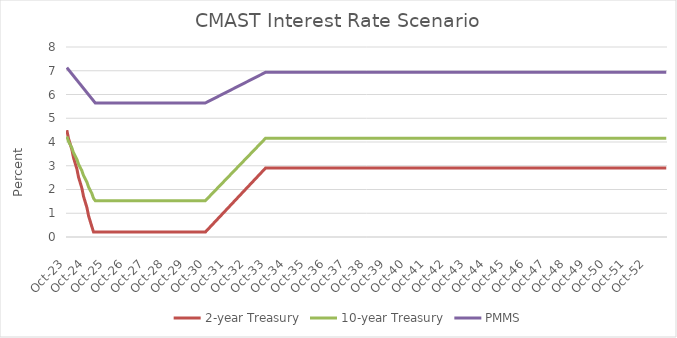
| Category | 2-year Treasury | 10-year Treasury | PMMS |
|---|---|---|---|
| 2023-10-31 | 4.498 | 4.233 | 7.132 |
| 2023-11-30 | 4.149 | 4.027 | 7.045 |
| 2023-12-30 | 3.917 | 3.89 | 6.957 |
| 2024-01-30 | 3.685 | 3.753 | 6.87 |
| 2024-02-29 | 3.336 | 3.547 | 6.782 |
| 2024-03-29 | 3.104 | 3.41 | 6.695 |
| 2024-04-29 | 2.872 | 3.273 | 6.607 |
| 2024-05-29 | 2.523 | 3.067 | 6.52 |
| 2024-06-29 | 2.291 | 2.93 | 6.432 |
| 2024-07-29 | 2.058 | 2.793 | 6.345 |
| 2024-08-29 | 1.71 | 2.587 | 6.257 |
| 2024-09-29 | 1.478 | 2.45 | 6.17 |
| 2024-10-29 | 1.245 | 2.313 | 6.082 |
| 2024-11-29 | 0.897 | 2.107 | 5.995 |
| 2024-12-29 | 0.665 | 1.97 | 5.907 |
| 2025-01-29 | 0.432 | 1.833 | 5.82 |
| 2025-02-28 | 0.21 | 1.627 | 5.732 |
| 2025-03-28 | 0.21 | 1.53 | 5.645 |
| 2025-04-28 | 0.21 | 1.53 | 5.645 |
| 2025-05-28 | 0.21 | 1.53 | 5.645 |
| 2025-06-28 | 0.21 | 1.53 | 5.645 |
| 2025-07-28 | 0.21 | 1.53 | 5.645 |
| 2025-08-28 | 0.21 | 1.53 | 5.645 |
| 2025-09-28 | 0.21 | 1.53 | 5.645 |
| 2025-10-28 | 0.21 | 1.53 | 5.645 |
| 2025-11-28 | 0.21 | 1.53 | 5.645 |
| 2025-12-28 | 0.21 | 1.53 | 5.645 |
| 2026-01-28 | 0.21 | 1.53 | 5.645 |
| 2026-02-28 | 0.21 | 1.53 | 5.645 |
| 2026-03-28 | 0.21 | 1.53 | 5.645 |
| 2026-04-28 | 0.21 | 1.53 | 5.645 |
| 2026-05-28 | 0.21 | 1.53 | 5.645 |
| 2026-06-28 | 0.21 | 1.53 | 5.645 |
| 2026-07-28 | 0.21 | 1.53 | 5.645 |
| 2026-08-28 | 0.21 | 1.53 | 5.645 |
| 2026-09-28 | 0.21 | 1.53 | 5.645 |
| 2026-10-28 | 0.21 | 1.53 | 5.645 |
| 2026-11-28 | 0.21 | 1.53 | 5.645 |
| 2026-12-28 | 0.21 | 1.53 | 5.645 |
| 2027-01-28 | 0.21 | 1.53 | 5.645 |
| 2027-02-28 | 0.21 | 1.53 | 5.645 |
| 2027-03-28 | 0.21 | 1.53 | 5.645 |
| 2027-04-28 | 0.21 | 1.53 | 5.645 |
| 2027-05-28 | 0.21 | 1.53 | 5.645 |
| 2027-06-28 | 0.21 | 1.53 | 5.645 |
| 2027-07-28 | 0.21 | 1.53 | 5.645 |
| 2027-08-28 | 0.21 | 1.53 | 5.645 |
| 2027-09-28 | 0.21 | 1.53 | 5.645 |
| 2027-10-28 | 0.21 | 1.53 | 5.645 |
| 2027-11-28 | 0.21 | 1.53 | 5.645 |
| 2027-12-28 | 0.21 | 1.53 | 5.645 |
| 2028-01-28 | 0.21 | 1.53 | 5.645 |
| 2028-02-28 | 0.21 | 1.53 | 5.645 |
| 2028-03-28 | 0.21 | 1.53 | 5.645 |
| 2028-04-28 | 0.21 | 1.53 | 5.645 |
| 2028-05-28 | 0.21 | 1.53 | 5.645 |
| 2028-06-28 | 0.21 | 1.53 | 5.645 |
| 2028-07-28 | 0.21 | 1.53 | 5.645 |
| 2028-08-28 | 0.21 | 1.53 | 5.645 |
| 2028-09-28 | 0.21 | 1.53 | 5.645 |
| 2028-10-28 | 0.21 | 1.53 | 5.645 |
| 2028-11-28 | 0.21 | 1.53 | 5.645 |
| 2028-12-28 | 0.21 | 1.53 | 5.645 |
| 2029-01-28 | 0.21 | 1.53 | 5.645 |
| 2029-02-28 | 0.21 | 1.53 | 5.645 |
| 2029-03-28 | 0.21 | 1.53 | 5.645 |
| 2029-04-28 | 0.21 | 1.53 | 5.645 |
| 2029-05-28 | 0.21 | 1.53 | 5.645 |
| 2029-06-28 | 0.21 | 1.53 | 5.645 |
| 2029-07-28 | 0.21 | 1.53 | 5.645 |
| 2029-08-28 | 0.21 | 1.53 | 5.645 |
| 2029-09-28 | 0.21 | 1.53 | 5.645 |
| 2029-10-28 | 0.21 | 1.53 | 5.645 |
| 2029-11-28 | 0.21 | 1.53 | 5.645 |
| 2029-12-28 | 0.21 | 1.53 | 5.645 |
| 2030-01-28 | 0.21 | 1.53 | 5.645 |
| 2030-02-28 | 0.21 | 1.53 | 5.645 |
| 2030-03-28 | 0.21 | 1.53 | 5.645 |
| 2030-04-28 | 0.21 | 1.53 | 5.645 |
| 2030-05-28 | 0.21 | 1.53 | 5.645 |
| 2030-06-28 | 0.21 | 1.53 | 5.645 |
| 2030-07-28 | 0.21 | 1.53 | 5.645 |
| 2030-08-28 | 0.21 | 1.53 | 5.645 |
| 2030-09-28 | 0.21 | 1.53 | 5.645 |
| 2030-10-28 | 0.285 | 1.603 | 5.681 |
| 2030-11-28 | 0.359 | 1.676 | 5.717 |
| 2030-12-28 | 0.434 | 1.749 | 5.752 |
| 2031-01-28 | 0.509 | 1.822 | 5.788 |
| 2031-02-28 | 0.584 | 1.895 | 5.824 |
| 2031-03-28 | 0.658 | 1.968 | 5.86 |
| 2031-04-28 | 0.733 | 2.04 | 5.896 |
| 2031-05-28 | 0.808 | 2.113 | 5.931 |
| 2031-06-28 | 0.883 | 2.186 | 5.967 |
| 2031-07-28 | 0.957 | 2.259 | 6.003 |
| 2031-08-28 | 1.032 | 2.332 | 6.039 |
| 2031-09-28 | 1.107 | 2.405 | 6.074 |
| 2031-10-28 | 1.181 | 2.478 | 6.11 |
| 2031-11-28 | 1.256 | 2.551 | 6.146 |
| 2031-12-28 | 1.331 | 2.624 | 6.182 |
| 2032-01-28 | 1.406 | 2.697 | 6.218 |
| 2032-02-28 | 1.48 | 2.77 | 6.253 |
| 2032-03-28 | 1.555 | 2.843 | 6.289 |
| 2032-04-28 | 1.63 | 2.915 | 6.325 |
| 2032-05-28 | 1.704 | 2.988 | 6.361 |
| 2032-06-28 | 1.779 | 3.061 | 6.397 |
| 2032-07-28 | 1.854 | 3.134 | 6.432 |
| 2032-08-28 | 1.929 | 3.207 | 6.468 |
| 2032-09-28 | 2.003 | 3.28 | 6.504 |
| 2032-10-28 | 2.078 | 3.353 | 6.54 |
| 2032-11-28 | 2.153 | 3.426 | 6.575 |
| 2032-12-28 | 2.228 | 3.499 | 6.611 |
| 2033-01-28 | 2.302 | 3.572 | 6.647 |
| 2033-02-28 | 2.377 | 3.645 | 6.683 |
| 2033-03-28 | 2.452 | 3.718 | 6.719 |
| 2033-04-28 | 2.526 | 3.79 | 6.754 |
| 2033-05-28 | 2.601 | 3.863 | 6.79 |
| 2033-06-28 | 2.676 | 3.936 | 6.826 |
| 2033-07-28 | 2.751 | 4.009 | 6.862 |
| 2033-08-28 | 2.825 | 4.082 | 6.898 |
| 2033-09-28 | 2.9 | 4.155 | 6.933 |
| 2033-10-28 | 2.9 | 4.155 | 6.933 |
| 2033-11-28 | 2.9 | 4.155 | 6.933 |
| 2033-12-28 | 2.9 | 4.155 | 6.933 |
| 2034-01-28 | 2.9 | 4.155 | 6.933 |
| 2034-02-28 | 2.9 | 4.155 | 6.933 |
| 2034-03-28 | 2.9 | 4.155 | 6.933 |
| 2034-04-28 | 2.9 | 4.155 | 6.933 |
| 2034-05-28 | 2.9 | 4.155 | 6.933 |
| 2034-06-28 | 2.9 | 4.155 | 6.933 |
| 2034-07-28 | 2.9 | 4.155 | 6.933 |
| 2034-08-28 | 2.9 | 4.155 | 6.933 |
| 2034-09-28 | 2.9 | 4.155 | 6.933 |
| 2034-10-28 | 2.9 | 4.155 | 6.933 |
| 2034-11-28 | 2.9 | 4.155 | 6.933 |
| 2034-12-28 | 2.9 | 4.155 | 6.933 |
| 2035-01-28 | 2.9 | 4.155 | 6.933 |
| 2035-02-28 | 2.9 | 4.155 | 6.933 |
| 2035-03-28 | 2.9 | 4.155 | 6.933 |
| 2035-04-28 | 2.9 | 4.155 | 6.933 |
| 2035-05-28 | 2.9 | 4.155 | 6.933 |
| 2035-06-28 | 2.9 | 4.155 | 6.933 |
| 2035-07-28 | 2.9 | 4.155 | 6.933 |
| 2035-08-28 | 2.9 | 4.155 | 6.933 |
| 2035-09-28 | 2.9 | 4.155 | 6.933 |
| 2035-10-28 | 2.9 | 4.155 | 6.933 |
| 2035-11-28 | 2.9 | 4.155 | 6.933 |
| 2035-12-28 | 2.9 | 4.155 | 6.933 |
| 2036-01-28 | 2.9 | 4.155 | 6.933 |
| 2036-02-28 | 2.9 | 4.155 | 6.933 |
| 2036-03-28 | 2.9 | 4.155 | 6.933 |
| 2036-04-28 | 2.9 | 4.155 | 6.933 |
| 2036-05-28 | 2.9 | 4.155 | 6.933 |
| 2036-06-28 | 2.9 | 4.155 | 6.933 |
| 2036-07-28 | 2.9 | 4.155 | 6.933 |
| 2036-08-28 | 2.9 | 4.155 | 6.933 |
| 2036-09-28 | 2.9 | 4.155 | 6.933 |
| 2036-10-28 | 2.9 | 4.155 | 6.933 |
| 2036-11-28 | 2.9 | 4.155 | 6.933 |
| 2036-12-28 | 2.9 | 4.155 | 6.933 |
| 2037-01-28 | 2.9 | 4.155 | 6.933 |
| 2037-02-28 | 2.9 | 4.155 | 6.933 |
| 2037-03-28 | 2.9 | 4.155 | 6.933 |
| 2037-04-28 | 2.9 | 4.155 | 6.933 |
| 2037-05-28 | 2.9 | 4.155 | 6.933 |
| 2037-06-28 | 2.9 | 4.155 | 6.933 |
| 2037-07-28 | 2.9 | 4.155 | 6.933 |
| 2037-08-28 | 2.9 | 4.155 | 6.933 |
| 2037-09-28 | 2.9 | 4.155 | 6.933 |
| 2037-10-28 | 2.9 | 4.155 | 6.933 |
| 2037-11-28 | 2.9 | 4.155 | 6.933 |
| 2037-12-28 | 2.9 | 4.155 | 6.933 |
| 2038-01-28 | 2.9 | 4.155 | 6.933 |
| 2038-02-28 | 2.9 | 4.155 | 6.933 |
| 2038-03-28 | 2.9 | 4.155 | 6.933 |
| 2038-04-28 | 2.9 | 4.155 | 6.933 |
| 2038-05-28 | 2.9 | 4.155 | 6.933 |
| 2038-06-28 | 2.9 | 4.155 | 6.933 |
| 2038-07-28 | 2.9 | 4.155 | 6.933 |
| 2038-08-28 | 2.9 | 4.155 | 6.933 |
| 2038-09-28 | 2.9 | 4.155 | 6.933 |
| 2038-10-28 | 2.9 | 4.155 | 6.933 |
| 2038-11-28 | 2.9 | 4.155 | 6.933 |
| 2038-12-28 | 2.9 | 4.155 | 6.933 |
| 2039-01-28 | 2.9 | 4.155 | 6.933 |
| 2039-02-28 | 2.9 | 4.155 | 6.933 |
| 2039-03-28 | 2.9 | 4.155 | 6.933 |
| 2039-04-28 | 2.9 | 4.155 | 6.933 |
| 2039-05-28 | 2.9 | 4.155 | 6.933 |
| 2039-06-28 | 2.9 | 4.155 | 6.933 |
| 2039-07-28 | 2.9 | 4.155 | 6.933 |
| 2039-08-28 | 2.9 | 4.155 | 6.933 |
| 2039-09-28 | 2.9 | 4.155 | 6.933 |
| 2039-10-28 | 2.9 | 4.155 | 6.933 |
| 2039-11-28 | 2.9 | 4.155 | 6.933 |
| 2039-12-28 | 2.9 | 4.155 | 6.933 |
| 2040-01-28 | 2.9 | 4.155 | 6.933 |
| 2040-02-28 | 2.9 | 4.155 | 6.933 |
| 2040-03-28 | 2.9 | 4.155 | 6.933 |
| 2040-04-28 | 2.9 | 4.155 | 6.933 |
| 2040-05-28 | 2.9 | 4.155 | 6.933 |
| 2040-06-28 | 2.9 | 4.155 | 6.933 |
| 2040-07-28 | 2.9 | 4.155 | 6.933 |
| 2040-08-28 | 2.9 | 4.155 | 6.933 |
| 2040-09-28 | 2.9 | 4.155 | 6.933 |
| 2040-10-28 | 2.9 | 4.155 | 6.933 |
| 2040-11-28 | 2.9 | 4.155 | 6.933 |
| 2040-12-28 | 2.9 | 4.155 | 6.933 |
| 2041-01-28 | 2.9 | 4.155 | 6.933 |
| 2041-02-28 | 2.9 | 4.155 | 6.933 |
| 2041-03-28 | 2.9 | 4.155 | 6.933 |
| 2041-04-28 | 2.9 | 4.155 | 6.933 |
| 2041-05-28 | 2.9 | 4.155 | 6.933 |
| 2041-06-28 | 2.9 | 4.155 | 6.933 |
| 2041-07-28 | 2.9 | 4.155 | 6.933 |
| 2041-08-28 | 2.9 | 4.155 | 6.933 |
| 2041-09-28 | 2.9 | 4.155 | 6.933 |
| 2041-10-28 | 2.9 | 4.155 | 6.933 |
| 2041-11-28 | 2.9 | 4.155 | 6.933 |
| 2041-12-28 | 2.9 | 4.155 | 6.933 |
| 2042-01-28 | 2.9 | 4.155 | 6.933 |
| 2042-02-28 | 2.9 | 4.155 | 6.933 |
| 2042-03-28 | 2.9 | 4.155 | 6.933 |
| 2042-04-28 | 2.9 | 4.155 | 6.933 |
| 2042-05-28 | 2.9 | 4.155 | 6.933 |
| 2042-06-28 | 2.9 | 4.155 | 6.933 |
| 2042-07-28 | 2.9 | 4.155 | 6.933 |
| 2042-08-28 | 2.9 | 4.155 | 6.933 |
| 2042-09-28 | 2.9 | 4.155 | 6.933 |
| 2042-10-28 | 2.9 | 4.155 | 6.933 |
| 2042-11-28 | 2.9 | 4.155 | 6.933 |
| 2042-12-28 | 2.9 | 4.155 | 6.933 |
| 2043-01-28 | 2.9 | 4.155 | 6.933 |
| 2043-02-28 | 2.9 | 4.155 | 6.933 |
| 2043-03-28 | 2.9 | 4.155 | 6.933 |
| 2043-04-28 | 2.9 | 4.155 | 6.933 |
| 2043-05-28 | 2.9 | 4.155 | 6.933 |
| 2043-06-28 | 2.9 | 4.155 | 6.933 |
| 2043-07-28 | 2.9 | 4.155 | 6.933 |
| 2043-08-28 | 2.9 | 4.155 | 6.933 |
| 2043-09-28 | 2.9 | 4.155 | 6.933 |
| 2043-10-28 | 2.9 | 4.155 | 6.933 |
| 2043-11-28 | 2.9 | 4.155 | 6.933 |
| 2043-12-28 | 2.9 | 4.155 | 6.933 |
| 2044-01-28 | 2.9 | 4.155 | 6.933 |
| 2044-02-28 | 2.9 | 4.155 | 6.933 |
| 2044-03-28 | 2.9 | 4.155 | 6.933 |
| 2044-04-28 | 2.9 | 4.155 | 6.933 |
| 2044-05-28 | 2.9 | 4.155 | 6.933 |
| 2044-06-28 | 2.9 | 4.155 | 6.933 |
| 2044-07-28 | 2.9 | 4.155 | 6.933 |
| 2044-08-28 | 2.9 | 4.155 | 6.933 |
| 2044-09-28 | 2.9 | 4.155 | 6.933 |
| 2044-10-28 | 2.9 | 4.155 | 6.933 |
| 2044-11-28 | 2.9 | 4.155 | 6.933 |
| 2044-12-28 | 2.9 | 4.155 | 6.933 |
| 2045-01-28 | 2.9 | 4.155 | 6.933 |
| 2045-02-28 | 2.9 | 4.155 | 6.933 |
| 2045-03-28 | 2.9 | 4.155 | 6.933 |
| 2045-04-28 | 2.9 | 4.155 | 6.933 |
| 2045-05-28 | 2.9 | 4.155 | 6.933 |
| 2045-06-28 | 2.9 | 4.155 | 6.933 |
| 2045-07-28 | 2.9 | 4.155 | 6.933 |
| 2045-08-28 | 2.9 | 4.155 | 6.933 |
| 2045-09-28 | 2.9 | 4.155 | 6.933 |
| 2045-10-28 | 2.9 | 4.155 | 6.933 |
| 2045-11-28 | 2.9 | 4.155 | 6.933 |
| 2045-12-28 | 2.9 | 4.155 | 6.933 |
| 2046-01-28 | 2.9 | 4.155 | 6.933 |
| 2046-02-28 | 2.9 | 4.155 | 6.933 |
| 2046-03-28 | 2.9 | 4.155 | 6.933 |
| 2046-04-28 | 2.9 | 4.155 | 6.933 |
| 2046-05-28 | 2.9 | 4.155 | 6.933 |
| 2046-06-28 | 2.9 | 4.155 | 6.933 |
| 2046-07-28 | 2.9 | 4.155 | 6.933 |
| 2046-08-28 | 2.9 | 4.155 | 6.933 |
| 2046-09-28 | 2.9 | 4.155 | 6.933 |
| 2046-10-28 | 2.9 | 4.155 | 6.933 |
| 2046-11-28 | 2.9 | 4.155 | 6.933 |
| 2046-12-28 | 2.9 | 4.155 | 6.933 |
| 2047-01-28 | 2.9 | 4.155 | 6.933 |
| 2047-02-28 | 2.9 | 4.155 | 6.933 |
| 2047-03-28 | 2.9 | 4.155 | 6.933 |
| 2047-04-28 | 2.9 | 4.155 | 6.933 |
| 2047-05-28 | 2.9 | 4.155 | 6.933 |
| 2047-06-28 | 2.9 | 4.155 | 6.933 |
| 2047-07-28 | 2.9 | 4.155 | 6.933 |
| 2047-08-28 | 2.9 | 4.155 | 6.933 |
| 2047-09-28 | 2.9 | 4.155 | 6.933 |
| 2047-10-28 | 2.9 | 4.155 | 6.933 |
| 2047-11-28 | 2.9 | 4.155 | 6.933 |
| 2047-12-28 | 2.9 | 4.155 | 6.933 |
| 2048-01-28 | 2.9 | 4.155 | 6.933 |
| 2048-02-28 | 2.9 | 4.155 | 6.933 |
| 2048-03-28 | 2.9 | 4.155 | 6.933 |
| 2048-04-28 | 2.9 | 4.155 | 6.933 |
| 2048-05-28 | 2.9 | 4.155 | 6.933 |
| 2048-06-28 | 2.9 | 4.155 | 6.933 |
| 2048-07-28 | 2.9 | 4.155 | 6.933 |
| 2048-08-28 | 2.9 | 4.155 | 6.933 |
| 2048-09-28 | 2.9 | 4.155 | 6.933 |
| 2048-10-28 | 2.9 | 4.155 | 6.933 |
| 2048-11-28 | 2.9 | 4.155 | 6.933 |
| 2048-12-28 | 2.9 | 4.155 | 6.933 |
| 2049-01-28 | 2.9 | 4.155 | 6.933 |
| 2049-02-28 | 2.9 | 4.155 | 6.933 |
| 2049-03-28 | 2.9 | 4.155 | 6.933 |
| 2049-04-28 | 2.9 | 4.155 | 6.933 |
| 2049-05-28 | 2.9 | 4.155 | 6.933 |
| 2049-06-28 | 2.9 | 4.155 | 6.933 |
| 2049-07-28 | 2.9 | 4.155 | 6.933 |
| 2049-08-28 | 2.9 | 4.155 | 6.933 |
| 2049-09-28 | 2.9 | 4.155 | 6.933 |
| 2049-10-28 | 2.9 | 4.155 | 6.933 |
| 2049-11-28 | 2.9 | 4.155 | 6.933 |
| 2049-12-28 | 2.9 | 4.155 | 6.933 |
| 2050-01-28 | 2.9 | 4.155 | 6.933 |
| 2050-02-28 | 2.9 | 4.155 | 6.933 |
| 2050-03-28 | 2.9 | 4.155 | 6.933 |
| 2050-04-28 | 2.9 | 4.155 | 6.933 |
| 2050-05-28 | 2.9 | 4.155 | 6.933 |
| 2050-06-28 | 2.9 | 4.155 | 6.933 |
| 2050-07-28 | 2.9 | 4.155 | 6.933 |
| 2050-08-28 | 2.9 | 4.155 | 6.933 |
| 2050-09-28 | 2.9 | 4.155 | 6.933 |
| 2050-10-28 | 2.9 | 4.155 | 6.933 |
| 2050-11-28 | 2.9 | 4.155 | 6.933 |
| 2050-12-28 | 2.9 | 4.155 | 6.933 |
| 2051-01-28 | 2.9 | 4.155 | 6.933 |
| 2051-02-28 | 2.9 | 4.155 | 6.933 |
| 2051-03-28 | 2.9 | 4.155 | 6.933 |
| 2051-04-28 | 2.9 | 4.155 | 6.933 |
| 2051-05-28 | 2.9 | 4.155 | 6.933 |
| 2051-06-28 | 2.9 | 4.155 | 6.933 |
| 2051-07-28 | 2.9 | 4.155 | 6.933 |
| 2051-08-28 | 2.9 | 4.155 | 6.933 |
| 2051-09-28 | 2.9 | 4.155 | 6.933 |
| 2051-10-28 | 2.9 | 4.155 | 6.933 |
| 2051-11-28 | 2.9 | 4.155 | 6.933 |
| 2051-12-28 | 2.9 | 4.155 | 6.933 |
| 2052-01-28 | 2.9 | 4.155 | 6.933 |
| 2052-02-28 | 2.9 | 4.155 | 6.933 |
| 2052-03-28 | 2.9 | 4.155 | 6.933 |
| 2052-04-28 | 2.9 | 4.155 | 6.933 |
| 2052-05-28 | 2.9 | 4.155 | 6.933 |
| 2052-06-28 | 2.9 | 4.155 | 6.933 |
| 2052-07-28 | 2.9 | 4.155 | 6.933 |
| 2052-08-28 | 2.9 | 4.155 | 6.933 |
| 2052-09-28 | 2.9 | 4.155 | 6.933 |
| 2052-10-28 | 2.9 | 4.155 | 6.933 |
| 2052-11-28 | 2.9 | 4.155 | 6.933 |
| 2052-12-28 | 2.9 | 4.155 | 6.933 |
| 2053-01-28 | 2.9 | 4.155 | 6.933 |
| 2053-02-28 | 2.9 | 4.155 | 6.933 |
| 2053-03-28 | 2.9 | 4.155 | 6.933 |
| 2053-04-28 | 2.9 | 4.155 | 6.933 |
| 2053-05-28 | 2.9 | 4.155 | 6.933 |
| 2053-06-28 | 2.9 | 4.155 | 6.933 |
| 2053-07-28 | 2.9 | 4.155 | 6.933 |
| 2053-08-28 | 2.9 | 4.155 | 6.933 |
| 2053-09-28 | 2.9 | 4.155 | 6.933 |